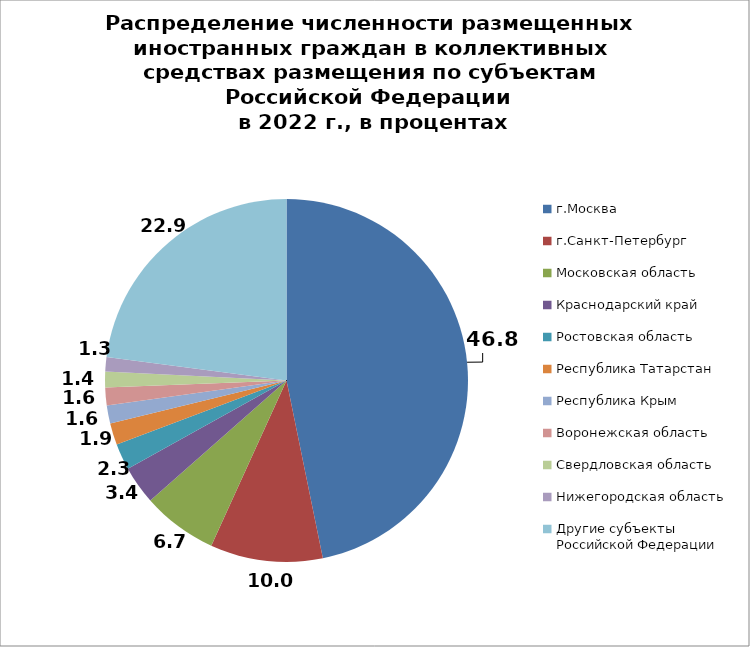
| Category | Series 0 |
|---|---|
| г.Москва | 46.789 |
| г.Санкт-Петербург | 10.015 |
| Московская область | 6.701 |
| Краснодарский край | 3.423 |
| Ростовская область | 2.326 |
| Республика Татарстан | 1.934 |
| Республика Крым | 1.608 |
| Воронежская область | 1.581 |
| Свердловская область | 1.414 |
| Нижегородская область | 1.267 |
| Другие субъекты Российской Федерации | 22.942 |